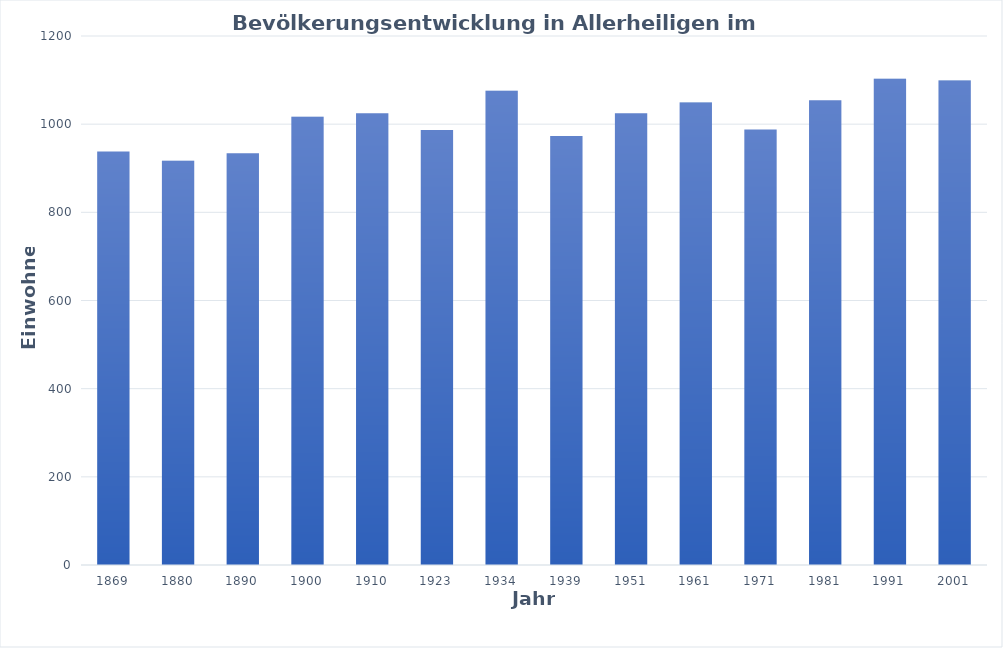
| Category | Anzahl  |
|---|---|
| 1869.0 | 938 |
| 1880.0 | 917 |
| 1890.0 | 934 |
| 1900.0 | 1017 |
| 1910.0 | 1025 |
| 1923.0 | 987 |
| 1934.0 | 1076 |
| 1939.0 | 973 |
| 1951.0 | 1025 |
| 1961.0 | 1049 |
| 1971.0 | 988 |
| 1981.0 | 1054 |
| 1991.0 | 1103 |
| 2001.0 | 1099 |